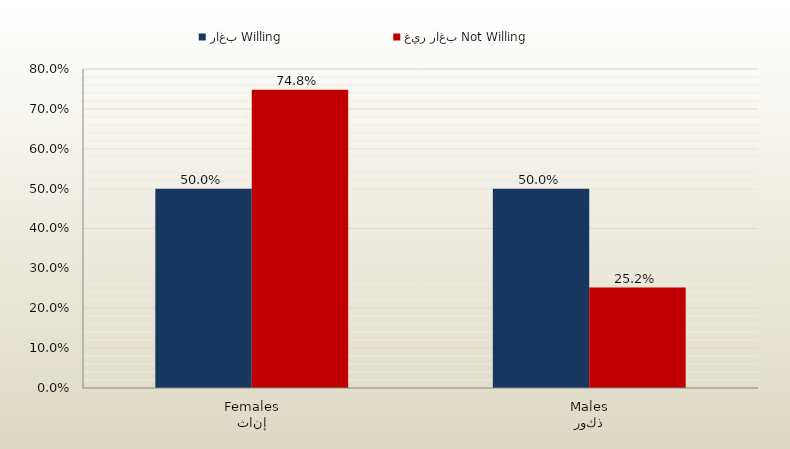
| Category | راغب Willing | غير راغب Not Willing |
|---|---|---|
| إناث
Females | 0.5 | 0.748 |
| ذكور
Males | 0.5 | 0.252 |